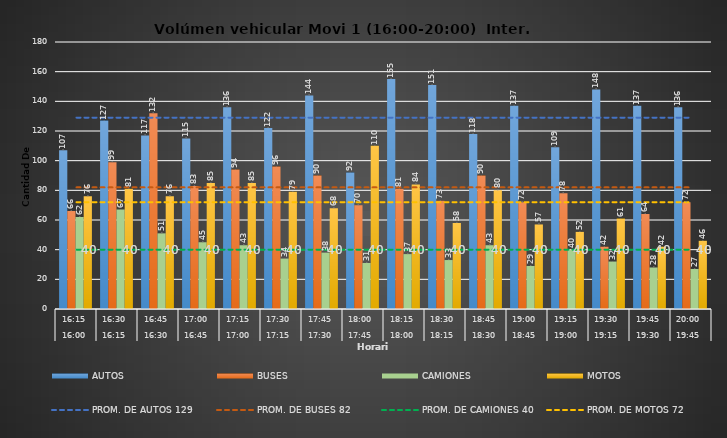
| Category | AUTOS | BUSES | CAMIONES | MOTOS |
|---|---|---|---|---|
| 0 | 107 | 66 | 62 | 76 |
| 1 | 127 | 99 | 67 | 81 |
| 2 | 117 | 132 | 51 | 76 |
| 3 | 115 | 83 | 45 | 85 |
| 4 | 136 | 94 | 43 | 85 |
| 5 | 122 | 96 | 34 | 79 |
| 6 | 144 | 90 | 38 | 68 |
| 7 | 92 | 70 | 31 | 110 |
| 8 | 155 | 81 | 37 | 84 |
| 9 | 151 | 73 | 33 | 58 |
| 10 | 118 | 90 | 43 | 80 |
| 11 | 137 | 72 | 29 | 57 |
| 12 | 109 | 78 | 40 | 52 |
| 13 | 148 | 42 | 32 | 61 |
| 14 | 137 | 64 | 28 | 42 |
| 15 | 136 | 72 | 27 | 46 |